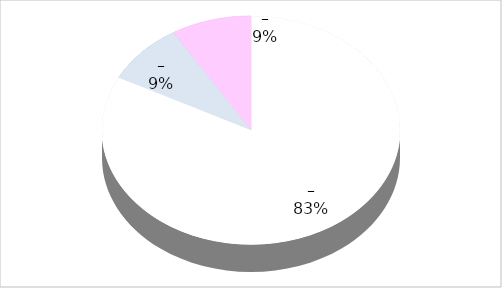
| Category | Series 0 |
|---|---|
| 0 | 19 |
| 1 | 2 |
| 2 | 2 |